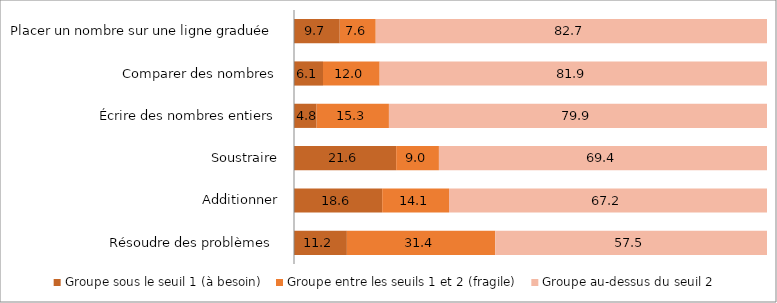
| Category | Groupe sous le seuil 1 (à besoin) | Groupe entre les seuils 1 et 2 (fragile) | Groupe au-dessus du seuil 2 |
|---|---|---|---|
| Résoudre des problèmes  | 11.18 | 31.36 | 57.46 |
| Additionner | 18.64 | 14.13 | 67.22 |
| Soustraire | 21.6 | 9.04 | 69.36 |
| Écrire des nombres entiers | 4.78 | 15.29 | 79.93 |
| Comparer des nombres | 6.13 | 11.98 | 81.89 |
| Placer un nombre sur une ligne graduée | 9.67 | 7.61 | 82.72 |